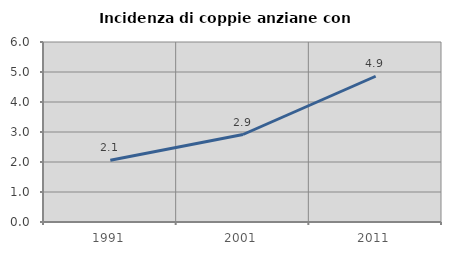
| Category | Incidenza di coppie anziane con figli |
|---|---|
| 1991.0 | 2.058 |
| 2001.0 | 2.917 |
| 2011.0 | 4.858 |